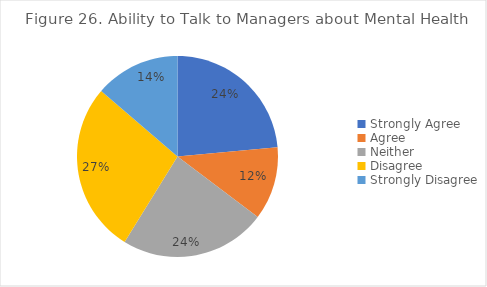
| Category | Series 0 |
|---|---|
| Strongly Agree | 0.235 |
| Agree | 0.118 |
| Neither | 0.235 |
| Disagree | 0.275 |
| Strongly Disagree | 0.137 |